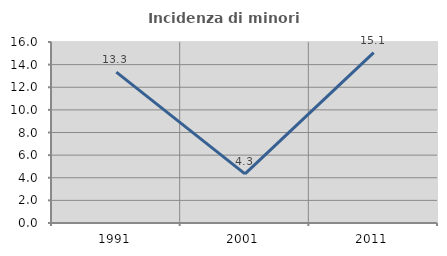
| Category | Incidenza di minori stranieri |
|---|---|
| 1991.0 | 13.333 |
| 2001.0 | 4.348 |
| 2011.0 | 15.068 |